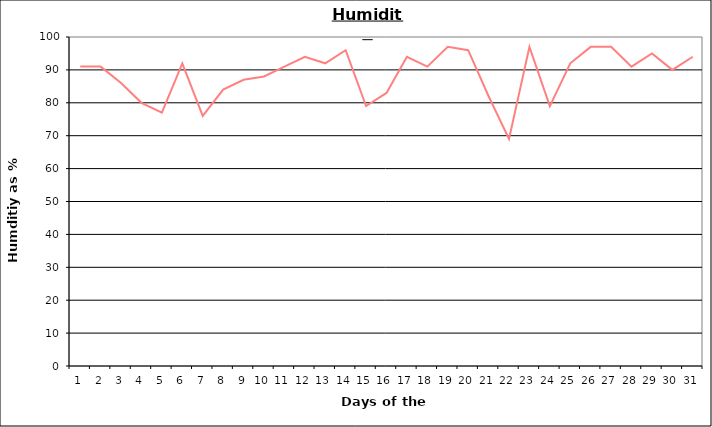
| Category | Series 0 |
|---|---|
| 0 | 91 |
| 1 | 91 |
| 2 | 86 |
| 3 | 80 |
| 4 | 77 |
| 5 | 92 |
| 6 | 76 |
| 7 | 84 |
| 8 | 87 |
| 9 | 88 |
| 10 | 91 |
| 11 | 94 |
| 12 | 92 |
| 13 | 96 |
| 14 | 79 |
| 15 | 83 |
| 16 | 94 |
| 17 | 91 |
| 18 | 97 |
| 19 | 96 |
| 20 | 82 |
| 21 | 69 |
| 22 | 97 |
| 23 | 79 |
| 24 | 92 |
| 25 | 97 |
| 26 | 97 |
| 27 | 91 |
| 28 | 95 |
| 29 | 90 |
| 30 | 94 |